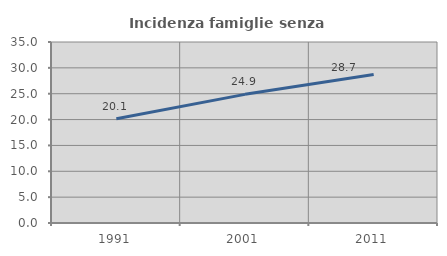
| Category | Incidenza famiglie senza nuclei |
|---|---|
| 1991.0 | 20.15 |
| 2001.0 | 24.877 |
| 2011.0 | 28.702 |